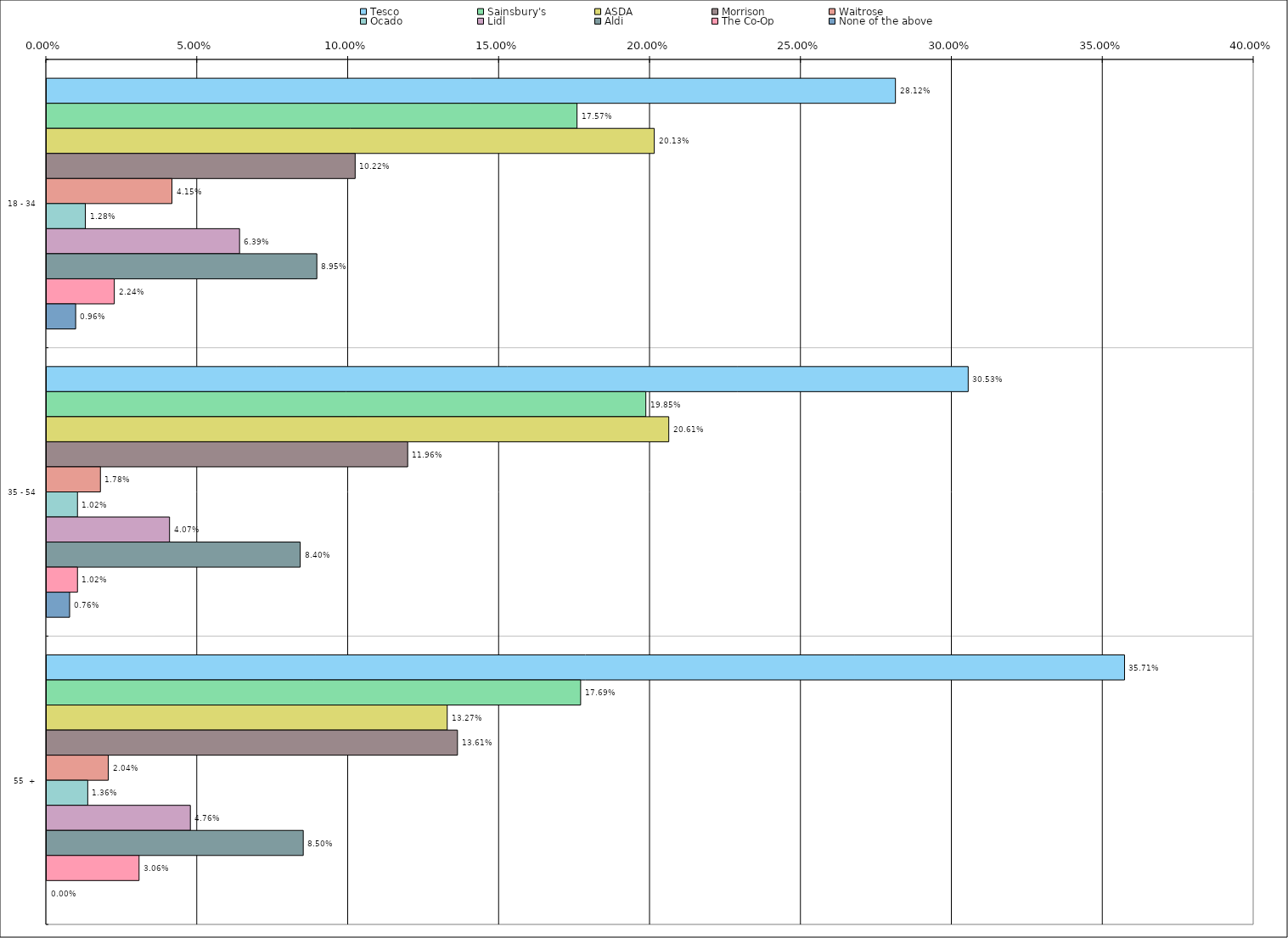
| Category | Tesco | Sainsbury's | ASDA | Morrison | Waitrose | Ocado | Lidl | Aldi | The Co-Op | None of the above |
|---|---|---|---|---|---|---|---|---|---|---|
| 0 | 0.281 | 0.176 | 0.201 | 0.102 | 0.042 | 0.013 | 0.064 | 0.09 | 0.022 | 0.01 |
| 1 | 0.305 | 0.198 | 0.206 | 0.12 | 0.018 | 0.01 | 0.041 | 0.084 | 0.01 | 0.008 |
| 2 | 0.357 | 0.177 | 0.133 | 0.136 | 0.02 | 0.014 | 0.048 | 0.085 | 0.031 | 0 |